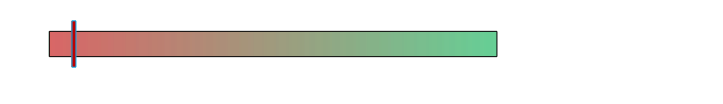
| Category | Spectrum |
|---|---|
| 0 | 100 |